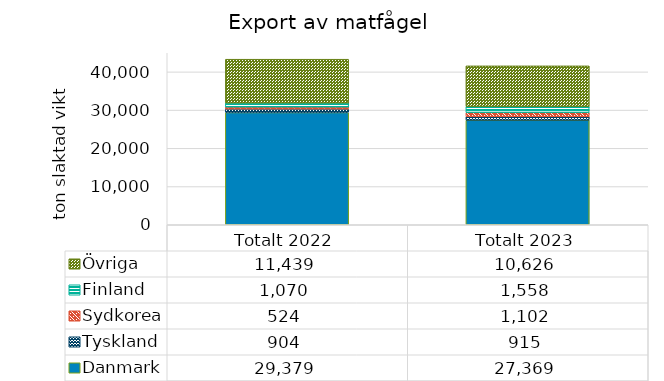
| Category | Danmark | Tyskland | Sydkorea | Finland | Övriga |
|---|---|---|---|---|---|
| Totalt 2022 | 29379.19 | 903.67 | 524 | 1069.63 | 11439.09 |
| Totalt 2023 | 27368.76 | 915.34 | 1102 | 1558.09 | 10626.12 |